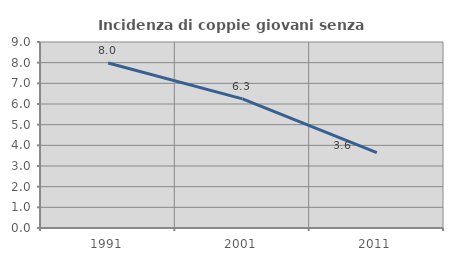
| Category | Incidenza di coppie giovani senza figli |
|---|---|
| 1991.0 | 7.982 |
| 2001.0 | 6.25 |
| 2011.0 | 3.643 |